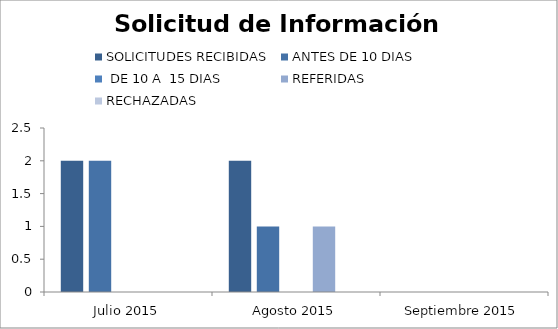
| Category | SOLICITUDES RECIBIDAS | ANTES DE 10 DIAS |  DE 10 A  15 DIAS  | REFERIDAS | RECHAZADAS |
|---|---|---|---|---|---|
| Julio 2015 | 2 | 2 | 0 | 0 | 0 |
| Agosto 2015 | 2 | 1 | 0 | 1 | 0 |
| Septiembre 2015 | 0 | 0 | 0 | 0 | 0 |